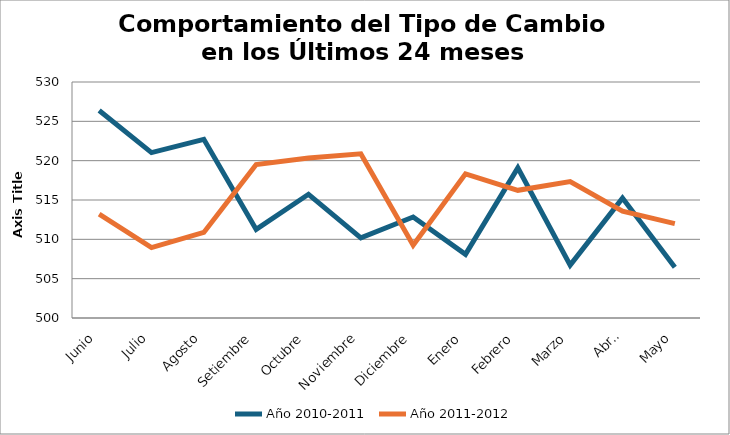
| Category | Año 2010-2011 | Año 2011-2012 |
|---|---|---|
| Junio | 526.38 | 513.2 |
| Julio | 521.02 | 508.95 |
| Agosto | 522.71 | 510.88 |
| Setiembre | 511.26 | 519.51 |
| Octubre | 515.73 | 520.34 |
| Noviembre | 510.18 | 520.87 |
| Diciembre | 512.84 | 509.26 |
| Enero | 508.09 | 518.33 |
| Febrero | 519.08 | 516.23 |
| Marzo | 506.72 | 517.35 |
| Abril | 515.24 | 513.58 |
| Mayo | 506.44 | 512 |